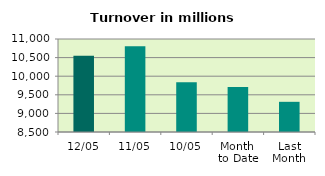
| Category | Series 0 |
|---|---|
| 12/05 | 10549.745 |
| 11/05 | 10807.967 |
| 10/05 | 9838.657 |
| Month 
to Date | 9709.61 |
| Last
Month | 9311.354 |